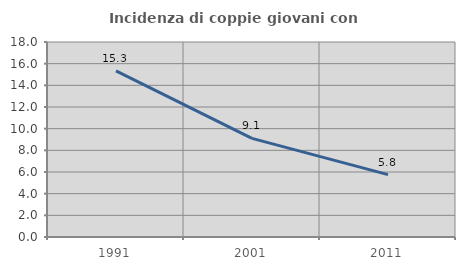
| Category | Incidenza di coppie giovani con figli |
|---|---|
| 1991.0 | 15.327 |
| 2001.0 | 9.1 |
| 2011.0 | 5.756 |